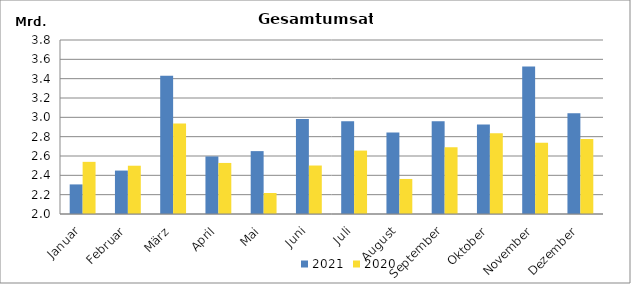
| Category | 2021 | 2020 |
|---|---|---|
| Januar | 2306120.804 | 2539450.607 |
| Februar | 2449271.437 | 2499447.241 |
| März | 3430363.188 | 2935539.861 |
| April | 2595438.804 | 2528135.954 |
| Mai | 2650475.646 | 2217049.026 |
| Juni | 2983325.678 | 2501528.316 |
| Juli | 2959118.83 | 2656008.177 |
| August | 2841953.391 | 2362426.503 |
| September | 2959052.328 | 2691402.738 |
| Oktober | 2926903.297 | 2836267.344 |
| November | 3524659.771 | 2737697.885 |
| Dezember | 3040974.324 | 2775362.16 |